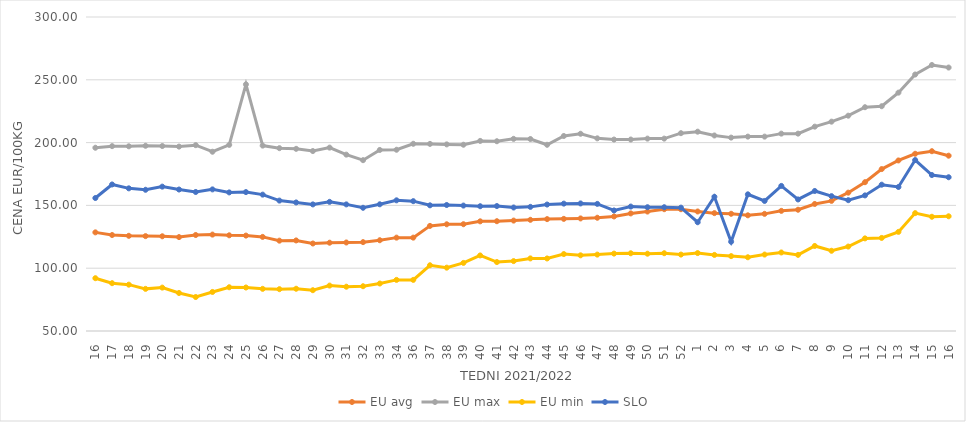
| Category | EU avg | EU max | EU min | SLO |
|---|---|---|---|---|
| 16.0 | 128.53 | 195.913 | 92.04 | 155.88 |
| 17.0 | 126.415 | 197.188 | 88.07 | 166.66 |
| 18.0 | 125.787 | 197.055 | 86.89 | 163.58 |
| 19.0 | 125.54 | 197.478 | 83.546 | 162.44 |
| 20.0 | 125.412 | 197.263 | 84.55 | 164.94 |
| 21.0 | 124.768 | 196.821 | 80.264 | 162.64 |
| 22.0 | 126.43 | 197.963 | 77.048 | 160.68 |
| 23.0 | 126.76 | 192.72 | 81.087 | 162.75 |
| 24.0 | 126.19 | 198.186 | 84.83 | 160.34 |
| 25.0 | 125.97 | 246.36 | 84.63 | 160.6 |
| 26.0 | 124.92 | 197.607 | 83.57 | 158.57 |
| 27.0 | 121.922 | 195.566 | 83.3 | 153.83 |
| 28.0 | 122.106 | 195.043 | 83.64 | 152.35 |
| 29.0 | 119.659 | 193.272 | 82.49 | 150.79 |
| 30.0 | 120.3 | 196.01 | 86.16 | 152.82 |
| 31.0 | 120.473 | 190.42 | 85.26 | 150.8 |
| 32.0 | 120.756 | 186 | 85.65 | 148.1 |
| 33.0 | 122.274 | 194.145 | 87.8 | 150.88 |
| 34.0 | 124.332 | 194.304 | 90.69 | 154.04 |
| 36.0 | 124.332 | 199.06 | 90.69 | 153.37 |
| 37.0 | 133.685 | 198.97 | 102.334 | 150.06 |
| 38.0 | 134.959 | 198.57 | 100.43 | 150.32 |
| 39.0 | 135.021 | 198.3 | 104.21 | 149.86 |
| 40.0 | 137.315 | 201.34 | 110.15 | 149.34 |
| 41.0 | 137.411 | 201.081 | 104.9 | 149.48 |
| 42.0 | 137.908 | 202.98 | 105.65 | 148.32 |
| 43.0 | 138.52 | 202.856 | 107.8 | 148.83 |
| 44.0 | 139.076 | 198.26 | 107.75 | 150.69 |
| 45.0 | 139.275 | 205.257 | 111.25 | 151.41 |
| 46.0 | 139.626 | 207.046 | 110.26 | 151.56 |
| 47.0 | 140.17 | 203.387 | 110.83 | 151.2 |
| 48.0 | 141.2 | 202.42 | 111.62 | 145.97 |
| 49.0 | 143.614 | 202.45 | 111.89 | 149.07 |
| 50.0 | 145.101 | 203.17 | 111.54 | 148.55 |
| 51.0 | 146.984 | 203.17 | 111.93 | 148.54 |
| 52.0 | 146.958 | 207.5 | 110.85 | 148.22 |
| 1.0 | 145.157 | 208.7 | 112.04 | 136.59 |
| 2.0 | 143.842 | 205.67 | 110.59 | 156.88 |
| 3.0 | 143.324 | 203.97 | 109.62 | 121.07 |
| 4.0 | 142.105 | 204.76 | 108.71 | 158.82 |
| 5.0 | 143.269 | 204.76 | 110.86 | 153.55 |
| 6.0 | 145.648 | 207.14 | 112.52 | 165.51 |
| 7.0 | 146.545 | 207.14 | 110.619 | 154.74 |
| 8.0 | 151.148 | 212.7 | 117.709 | 161.48 |
| 9.0 | 153.62 | 216.67 | 113.871 | 157.38 |
| 10.0 | 160.142 | 221.43 | 117.233 | 154.16 |
| 11.0 | 168.465 | 228.17 | 123.737 | 157.96 |
| 12.0 | 178.919 | 228.97 | 124.105 | 166.49 |
| 13.0 | 185.792 | 239.77 | 128.918 | 164.66 |
| 14.0 | 191.103 | 254.21 | 143.85 | 186.11 |
| 15.0 | 193.148 | 261.79 | 140.954 | 174.18 |
| 16.0 | 189.581 | 259.76 | 141.337 | 172.42 |